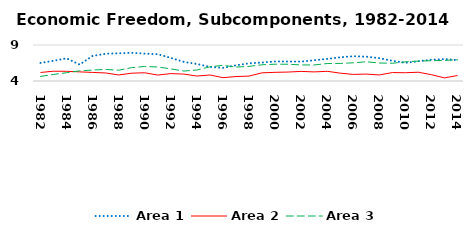
| Category | Area 1 | Area 2 | Area 3 |
|---|---|---|---|
| 1982.0 | 6.508 | 5.184 | 4.638 |
| 1983.0 | 6.806 | 5.358 | 4.914 |
| 1984.0 | 7.148 | 5.346 | 5.154 |
| 1985.0 | 6.28 | 5.268 | 5.406 |
| 1986.0 | 7.486 | 5.19 | 5.528 |
| 1987.0 | 7.785 | 5.117 | 5.602 |
| 1988.0 | 7.849 | 4.839 | 5.499 |
| 1989.0 | 7.918 | 5.087 | 5.854 |
| 1990.0 | 7.8 | 5.144 | 6.016 |
| 1991.0 | 7.724 | 4.824 | 5.947 |
| 1992.0 | 7.204 | 5.028 | 5.682 |
| 1993.0 | 6.653 | 4.958 | 5.383 |
| 1994.0 | 6.363 | 4.689 | 5.525 |
| 1995.0 | 5.952 | 4.835 | 5.973 |
| 1996.0 | 5.824 | 4.463 | 6.171 |
| 1997.0 | 6.171 | 4.617 | 5.935 |
| 1998.0 | 6.454 | 4.683 | 6.035 |
| 1999.0 | 6.566 | 5.137 | 6.253 |
| 2000.0 | 6.716 | 5.204 | 6.332 |
| 2001.0 | 6.706 | 5.243 | 6.328 |
| 2002.0 | 6.697 | 5.331 | 6.23 |
| 2003.0 | 6.885 | 5.263 | 6.227 |
| 2004.0 | 7.073 | 5.346 | 6.424 |
| 2005.0 | 7.289 | 5.09 | 6.44 |
| 2006.0 | 7.445 | 4.913 | 6.525 |
| 2007.0 | 7.38 | 4.959 | 6.672 |
| 2008.0 | 7.172 | 4.844 | 6.499 |
| 2009.0 | 6.813 | 5.17 | 6.464 |
| 2010.0 | 6.526 | 5.149 | 6.657 |
| 2011.0 | 6.753 | 5.218 | 6.764 |
| 2012.0 | 6.948 | 4.874 | 6.821 |
| 2013.0 | 7.046 | 4.432 | 6.864 |
| 2014.0 | 6.903 | 4.762 | 6.938 |